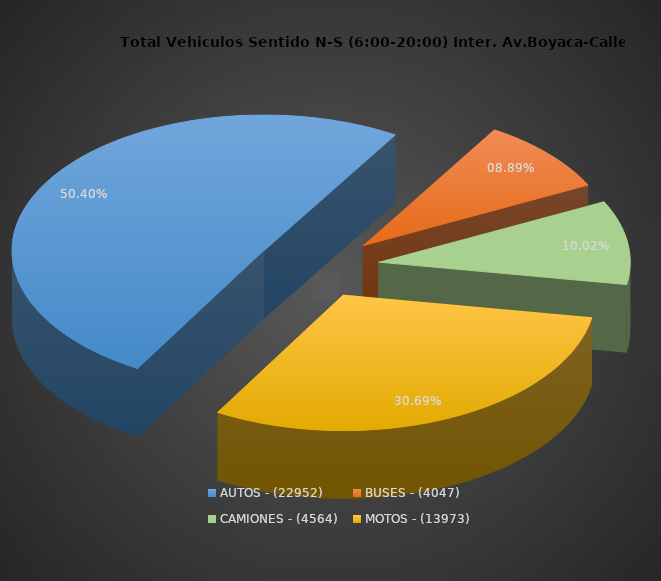
| Category | PORCENTAJE |
|---|---|
| AUTOS - (22952) | 50.404 |
| BUSES - (4047) | 8.887 |
| CAMIONES - (4564) | 10.023 |
| MOTOS - (13973) | 30.686 |